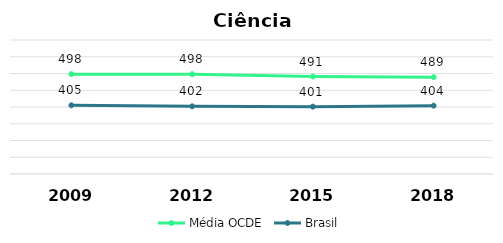
| Category | Média OCDE | Brasil |
|---|---|---|
| 2009.0 | 498 | 405 |
| 2012.0 | 498 | 402 |
| 2015.0 | 491 | 401 |
| 2018.0 | 489 | 404 |